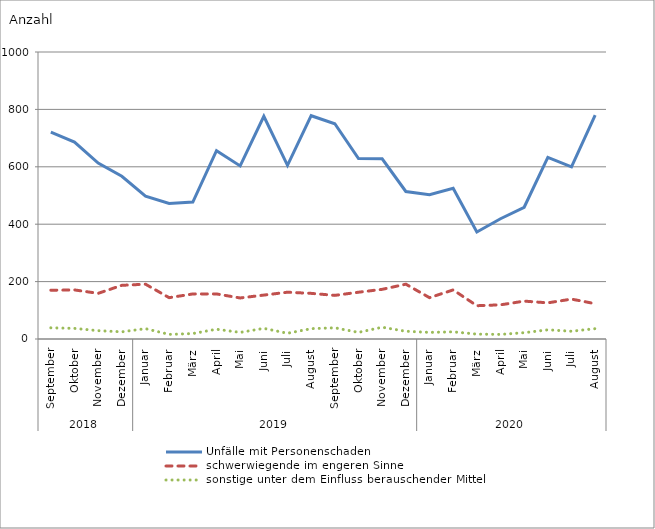
| Category | Unfälle mit Personenschaden | schwerwiegende im engeren Sinne | sonstige unter dem Einfluss berauschender Mittel |
|---|---|---|---|
| 0 | 721 | 170 | 39 |
| 1 | 686 | 171 | 37 |
| 2 | 613 | 159 | 29 |
| 3 | 567 | 187 | 25 |
| 4 | 498 | 191 | 36 |
| 5 | 472 | 144 | 16 |
| 6 | 477 | 157 | 19 |
| 7 | 656 | 157 | 34 |
| 8 | 603 | 143 | 23 |
| 9 | 776 | 153 | 37 |
| 10 | 605 | 163 | 20 |
| 11 | 778 | 159 | 36 |
| 12 | 750 | 152 | 39 |
| 13 | 629 | 163 | 23 |
| 14 | 628 | 173 | 41 |
| 15 | 514 | 191 | 27 |
| 16 | 503 | 144 | 23 |
| 17 | 525 | 171 | 25 |
| 18 | 373 | 116 | 17 |
| 19 | 419 | 119 | 16 |
| 20 | 459 | 132 | 22 |
| 21 | 633 | 126 | 32 |
| 22 | 600 | 139 | 27 |
| 23 | 780 | 123 | 36 |